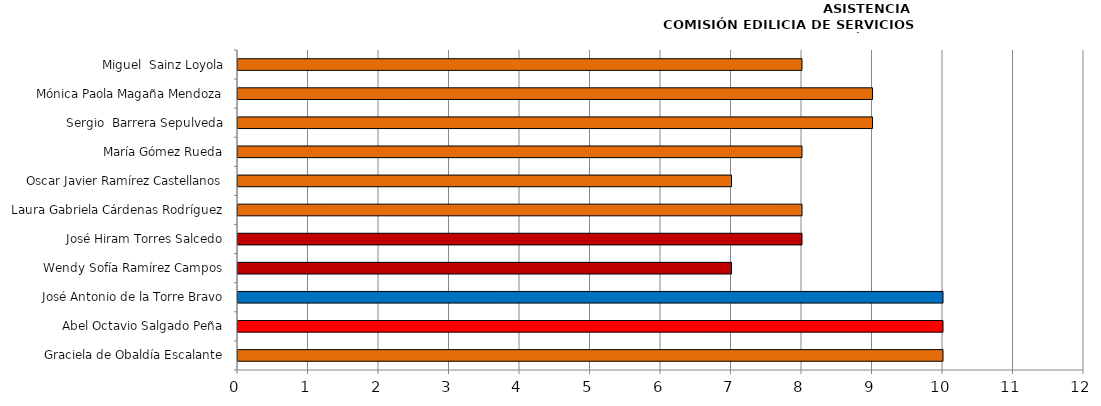
| Category | Series 0 |
|---|---|
| Graciela de Obaldía Escalante | 10 |
| Abel Octavio Salgado Peña | 10 |
| José Antonio de la Torre Bravo | 10 |
| Wendy Sofía Ramírez Campos | 7 |
| José Hiram Torres Salcedo | 8 |
| Laura Gabriela Cárdenas Rodríguez | 8 |
| Oscar Javier Ramírez Castellanos | 7 |
| María Gómez Rueda | 8 |
| Sergio  Barrera Sepulveda | 9 |
| Mónica Paola Magaña Mendoza | 9 |
| Miguel  Sainz Loyola | 8 |